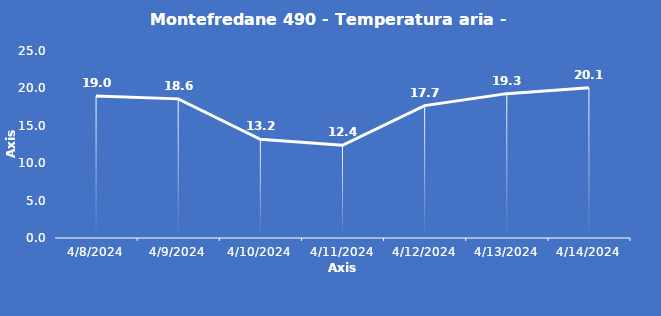
| Category | Montefredane 490 - Temperatura aria - Grezzo (°C) |
|---|---|
| 4/8/24 | 19 |
| 4/9/24 | 18.6 |
| 4/10/24 | 13.2 |
| 4/11/24 | 12.4 |
| 4/12/24 | 17.7 |
| 4/13/24 | 19.3 |
| 4/14/24 | 20.1 |